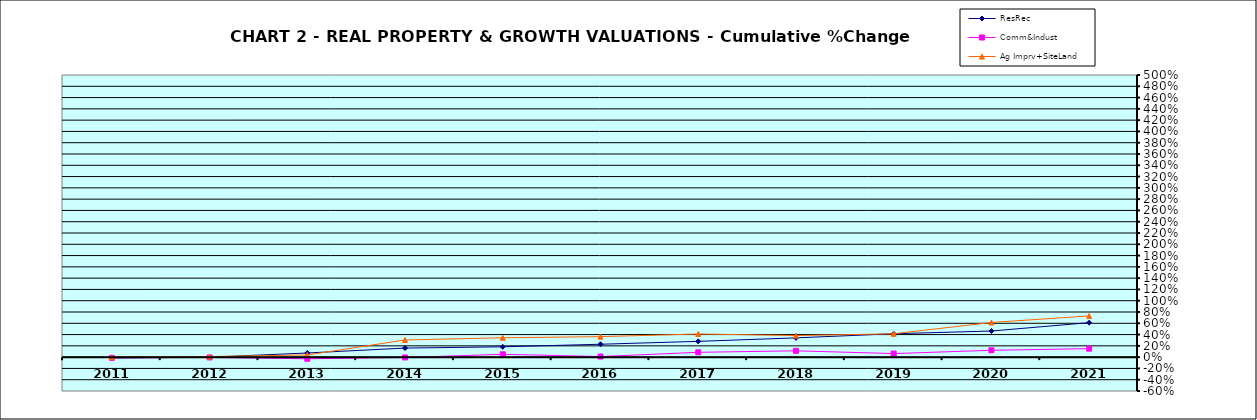
| Category | ResRec | Comm&Indust | Ag Imprv+SiteLand |
|---|---|---|---|
| 2011.0 | -0.015 | -0.012 | 0 |
| 2012.0 | -0.001 | -0.005 | 0.01 |
| 2013.0 | 0.074 | -0.029 | 0.039 |
| 2014.0 | 0.161 | -0.006 | 0.304 |
| 2015.0 | 0.183 | 0.05 | 0.343 |
| 2016.0 | 0.229 | 0.011 | 0.363 |
| 2017.0 | 0.28 | 0.086 | 0.41 |
| 2018.0 | 0.341 | 0.112 | 0.383 |
| 2019.0 | 0.415 | 0.063 | 0.414 |
| 2020.0 | 0.463 | 0.122 | 0.614 |
| 2021.0 | 0.611 | 0.15 | 0.731 |